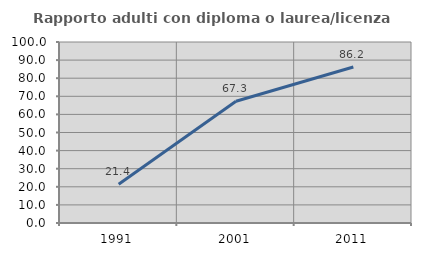
| Category | Rapporto adulti con diploma o laurea/licenza media  |
|---|---|
| 1991.0 | 21.429 |
| 2001.0 | 67.273 |
| 2011.0 | 86.207 |